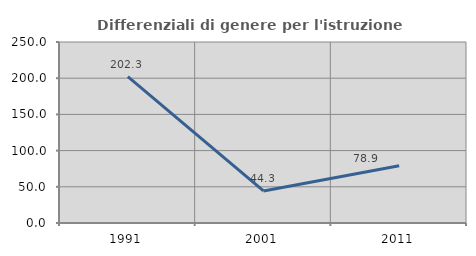
| Category | Differenziali di genere per l'istruzione superiore |
|---|---|
| 1991.0 | 202.261 |
| 2001.0 | 44.274 |
| 2011.0 | 78.947 |